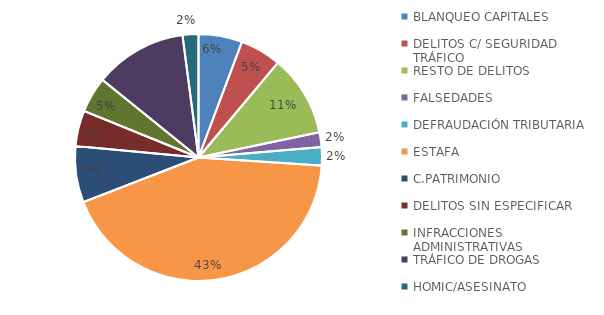
| Category | Nº |
|---|---|
| BLANQUEO CAPITALES | 519 |
| DELITOS C/ SEGURIDAD TRÁFICO | 487 |
| RESTO DE DELITOS | 963 |
| FALSEDADES | 176 |
| DEFRAUDACIÓN TRIBUTARIA | 216 |
| ESTAFA | 3905 |
| C.PATRIMONIO | 667 |
| DELITOS SIN ESPECIFICAR | 423 |
| INFRACCIONES ADMINISTRATIVAS | 424 |
| TRÁFICO DE DROGAS | 1098 |
| HOMIC/ASESINATO | 188 |